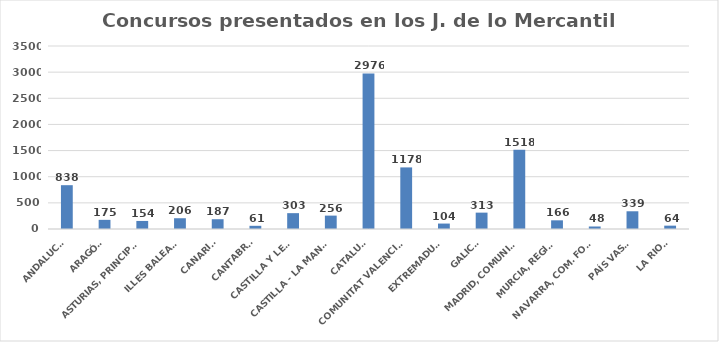
| Category | Series 0 |
|---|---|
| ANDALUCÍA | 838 |
| ARAGÓN | 175 |
| ASTURIAS, PRINCIPADO | 154 |
| ILLES BALEARS | 206 |
| CANARIAS | 187 |
| CANTABRIA | 61 |
| CASTILLA Y LEÓN | 303 |
| CASTILLA - LA MANCHA | 256 |
| CATALUÑA | 2976 |
| COMUNITAT VALENCIANA | 1178 |
| EXTREMADURA | 104 |
| GALICIA | 313 |
| MADRID, COMUNIDAD | 1518 |
| MURCIA, REGIÓN | 166 |
| NAVARRA, COM. FORAL | 48 |
| PAÍS VASCO | 339 |
| LA RIOJA | 64 |